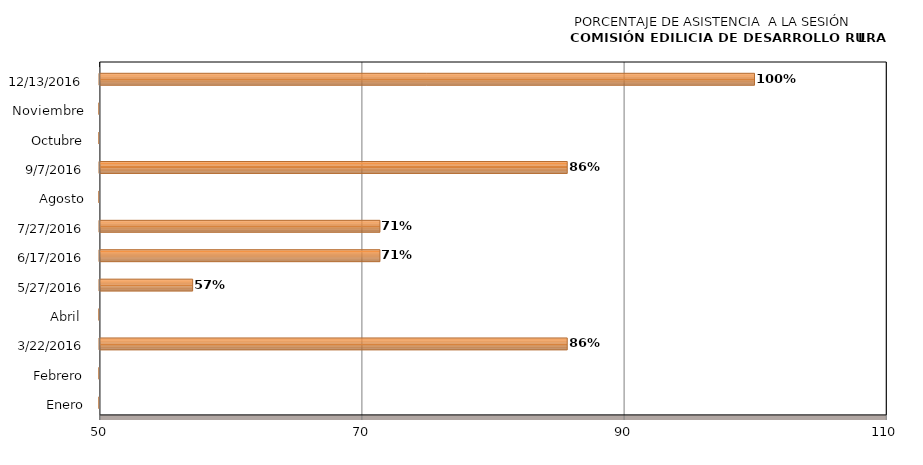
| Category | Series 0 |
|---|---|
| Enero | 0 |
| Febrero | 0 |
| 22/03/2016 | 85.714 |
| Abril  | 0 |
| 27/05/2016 | 57.143 |
| 17/06/2016 | 71.429 |
| 27/07/2016 | 71.429 |
| Agosto | 0 |
| 07/09/2016 | 85.714 |
| Octubre | 0 |
| Noviembre | 0 |
| 13/12/2016 | 100 |